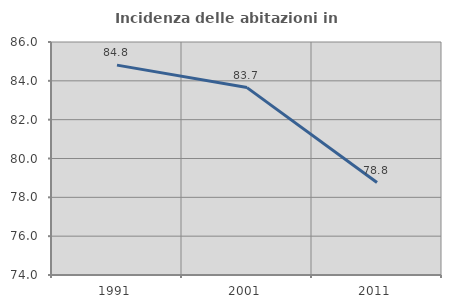
| Category | Incidenza delle abitazioni in proprietà  |
|---|---|
| 1991.0 | 84.81 |
| 2001.0 | 83.652 |
| 2011.0 | 78.763 |